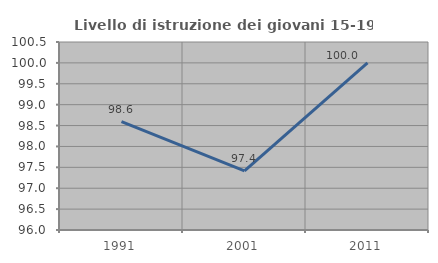
| Category | Livello di istruzione dei giovani 15-19 anni |
|---|---|
| 1991.0 | 98.592 |
| 2001.0 | 97.414 |
| 2011.0 | 100 |